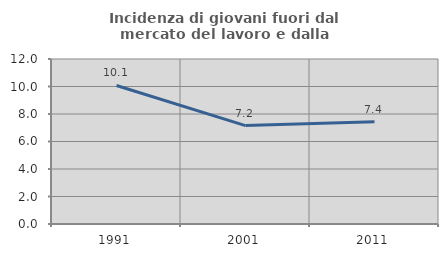
| Category | Incidenza di giovani fuori dal mercato del lavoro e dalla formazione  |
|---|---|
| 1991.0 | 10.075 |
| 2001.0 | 7.155 |
| 2011.0 | 7.431 |